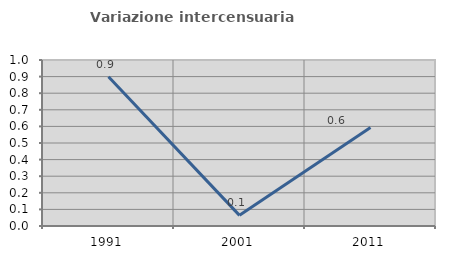
| Category | Variazione intercensuaria annua |
|---|---|
| 1991.0 | 0.899 |
| 2001.0 | 0.064 |
| 2011.0 | 0.594 |